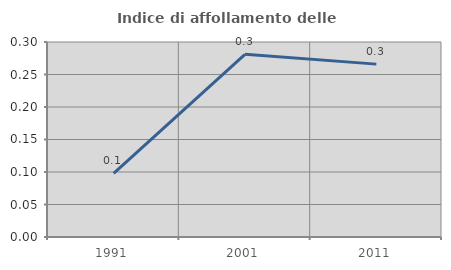
| Category | Indice di affollamento delle abitazioni  |
|---|---|
| 1991.0 | 0.098 |
| 2001.0 | 0.281 |
| 2011.0 | 0.266 |